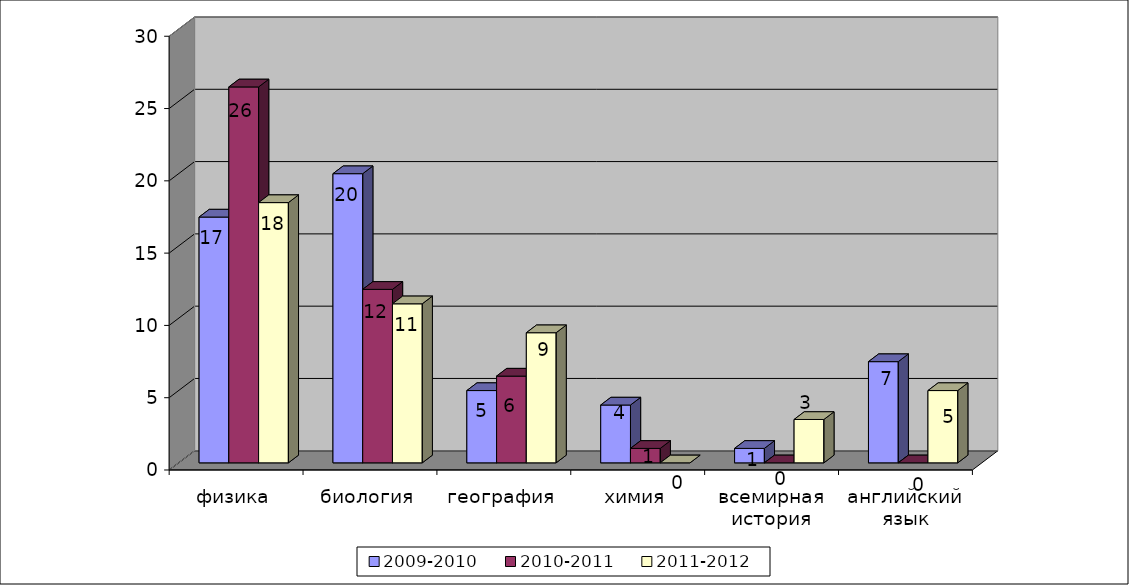
| Category | 2009-2010 | 2010-2011 | 2011-2012 |
|---|---|---|---|
| физика | 17 | 26 | 18 |
| биология | 20 | 12 | 11 |
| география | 5 | 6 | 9 |
| химия | 4 | 1 | 0 |
| всемирная история | 1 | 0 | 3 |
| английский язык | 7 | 0 | 5 |